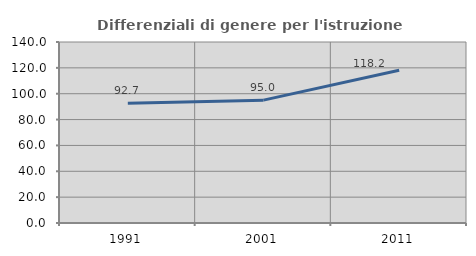
| Category | Differenziali di genere per l'istruzione superiore |
|---|---|
| 1991.0 | 92.674 |
| 2001.0 | 95.02 |
| 2011.0 | 118.182 |